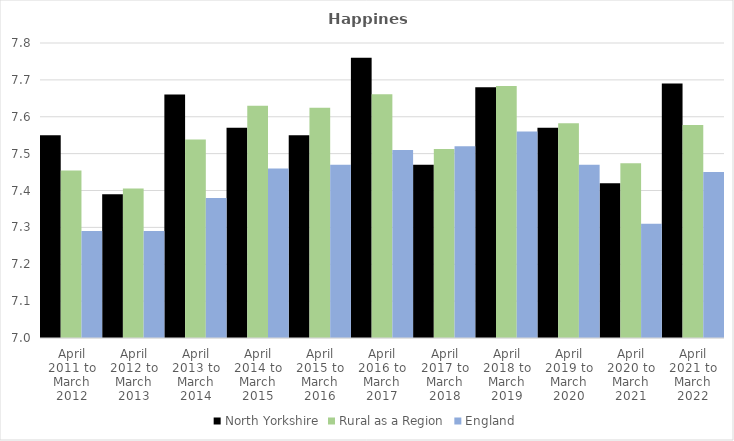
| Category | North Yorkshire | Rural as a Region | England |
|---|---|---|---|
| April 2011 to March 2012 | 7.55 | 7.454 | 7.29 |
| April 2012 to March 2013 | 7.39 | 7.406 | 7.29 |
| April 2013 to March 2014 | 7.66 | 7.539 | 7.38 |
| April 2014 to March 2015 | 7.57 | 7.63 | 7.46 |
| April 2015 to March 2016 | 7.55 | 7.625 | 7.47 |
| April 2016 to March 2017 | 7.76 | 7.661 | 7.51 |
| April 2017 to March 2018 | 7.47 | 7.513 | 7.52 |
| April 2018 to March 2019 | 7.68 | 7.684 | 7.56 |
| April 2019 to March 2020 | 7.57 | 7.582 | 7.47 |
| April 2020 to March 2021 | 7.42 | 7.474 | 7.31 |
| April 2021 to March 2022 | 7.69 | 7.577 | 7.45 |